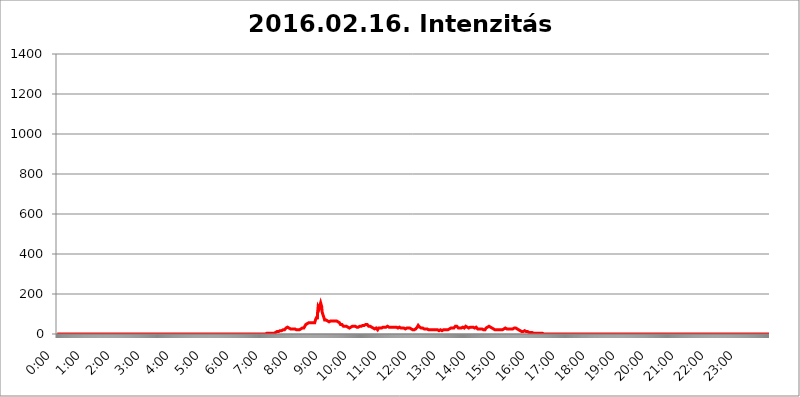
| Category | 2016.02.16. Intenzitás [W/m^2] |
|---|---|
| 0.0 | 0 |
| 0.0006944444444444445 | 0 |
| 0.001388888888888889 | 0 |
| 0.0020833333333333333 | 0 |
| 0.002777777777777778 | 0 |
| 0.003472222222222222 | 0 |
| 0.004166666666666667 | 0 |
| 0.004861111111111111 | 0 |
| 0.005555555555555556 | 0 |
| 0.0062499999999999995 | 0 |
| 0.006944444444444444 | 0 |
| 0.007638888888888889 | 0 |
| 0.008333333333333333 | 0 |
| 0.009027777777777779 | 0 |
| 0.009722222222222222 | 0 |
| 0.010416666666666666 | 0 |
| 0.011111111111111112 | 0 |
| 0.011805555555555555 | 0 |
| 0.012499999999999999 | 0 |
| 0.013194444444444444 | 0 |
| 0.013888888888888888 | 0 |
| 0.014583333333333332 | 0 |
| 0.015277777777777777 | 0 |
| 0.015972222222222224 | 0 |
| 0.016666666666666666 | 0 |
| 0.017361111111111112 | 0 |
| 0.018055555555555557 | 0 |
| 0.01875 | 0 |
| 0.019444444444444445 | 0 |
| 0.02013888888888889 | 0 |
| 0.020833333333333332 | 0 |
| 0.02152777777777778 | 0 |
| 0.022222222222222223 | 0 |
| 0.02291666666666667 | 0 |
| 0.02361111111111111 | 0 |
| 0.024305555555555556 | 0 |
| 0.024999999999999998 | 0 |
| 0.025694444444444447 | 0 |
| 0.02638888888888889 | 0 |
| 0.027083333333333334 | 0 |
| 0.027777777777777776 | 0 |
| 0.02847222222222222 | 0 |
| 0.029166666666666664 | 0 |
| 0.029861111111111113 | 0 |
| 0.030555555555555555 | 0 |
| 0.03125 | 0 |
| 0.03194444444444445 | 0 |
| 0.03263888888888889 | 0 |
| 0.03333333333333333 | 0 |
| 0.034027777777777775 | 0 |
| 0.034722222222222224 | 0 |
| 0.035416666666666666 | 0 |
| 0.036111111111111115 | 0 |
| 0.03680555555555556 | 0 |
| 0.0375 | 0 |
| 0.03819444444444444 | 0 |
| 0.03888888888888889 | 0 |
| 0.03958333333333333 | 0 |
| 0.04027777777777778 | 0 |
| 0.04097222222222222 | 0 |
| 0.041666666666666664 | 0 |
| 0.042361111111111106 | 0 |
| 0.04305555555555556 | 0 |
| 0.043750000000000004 | 0 |
| 0.044444444444444446 | 0 |
| 0.04513888888888889 | 0 |
| 0.04583333333333334 | 0 |
| 0.04652777777777778 | 0 |
| 0.04722222222222222 | 0 |
| 0.04791666666666666 | 0 |
| 0.04861111111111111 | 0 |
| 0.049305555555555554 | 0 |
| 0.049999999999999996 | 0 |
| 0.05069444444444445 | 0 |
| 0.051388888888888894 | 0 |
| 0.052083333333333336 | 0 |
| 0.05277777777777778 | 0 |
| 0.05347222222222222 | 0 |
| 0.05416666666666667 | 0 |
| 0.05486111111111111 | 0 |
| 0.05555555555555555 | 0 |
| 0.05625 | 0 |
| 0.05694444444444444 | 0 |
| 0.057638888888888885 | 0 |
| 0.05833333333333333 | 0 |
| 0.05902777777777778 | 0 |
| 0.059722222222222225 | 0 |
| 0.06041666666666667 | 0 |
| 0.061111111111111116 | 0 |
| 0.06180555555555556 | 0 |
| 0.0625 | 0 |
| 0.06319444444444444 | 0 |
| 0.06388888888888888 | 0 |
| 0.06458333333333334 | 0 |
| 0.06527777777777778 | 0 |
| 0.06597222222222222 | 0 |
| 0.06666666666666667 | 0 |
| 0.06736111111111111 | 0 |
| 0.06805555555555555 | 0 |
| 0.06874999999999999 | 0 |
| 0.06944444444444443 | 0 |
| 0.07013888888888889 | 0 |
| 0.07083333333333333 | 0 |
| 0.07152777777777779 | 0 |
| 0.07222222222222223 | 0 |
| 0.07291666666666667 | 0 |
| 0.07361111111111111 | 0 |
| 0.07430555555555556 | 0 |
| 0.075 | 0 |
| 0.07569444444444444 | 0 |
| 0.0763888888888889 | 0 |
| 0.07708333333333334 | 0 |
| 0.07777777777777778 | 0 |
| 0.07847222222222222 | 0 |
| 0.07916666666666666 | 0 |
| 0.0798611111111111 | 0 |
| 0.08055555555555556 | 0 |
| 0.08125 | 0 |
| 0.08194444444444444 | 0 |
| 0.08263888888888889 | 0 |
| 0.08333333333333333 | 0 |
| 0.08402777777777777 | 0 |
| 0.08472222222222221 | 0 |
| 0.08541666666666665 | 0 |
| 0.08611111111111112 | 0 |
| 0.08680555555555557 | 0 |
| 0.08750000000000001 | 0 |
| 0.08819444444444445 | 0 |
| 0.08888888888888889 | 0 |
| 0.08958333333333333 | 0 |
| 0.09027777777777778 | 0 |
| 0.09097222222222222 | 0 |
| 0.09166666666666667 | 0 |
| 0.09236111111111112 | 0 |
| 0.09305555555555556 | 0 |
| 0.09375 | 0 |
| 0.09444444444444444 | 0 |
| 0.09513888888888888 | 0 |
| 0.09583333333333333 | 0 |
| 0.09652777777777777 | 0 |
| 0.09722222222222222 | 0 |
| 0.09791666666666667 | 0 |
| 0.09861111111111111 | 0 |
| 0.09930555555555555 | 0 |
| 0.09999999999999999 | 0 |
| 0.10069444444444443 | 0 |
| 0.1013888888888889 | 0 |
| 0.10208333333333335 | 0 |
| 0.10277777777777779 | 0 |
| 0.10347222222222223 | 0 |
| 0.10416666666666667 | 0 |
| 0.10486111111111111 | 0 |
| 0.10555555555555556 | 0 |
| 0.10625 | 0 |
| 0.10694444444444444 | 0 |
| 0.1076388888888889 | 0 |
| 0.10833333333333334 | 0 |
| 0.10902777777777778 | 0 |
| 0.10972222222222222 | 0 |
| 0.1111111111111111 | 0 |
| 0.11180555555555556 | 0 |
| 0.11180555555555556 | 0 |
| 0.1125 | 0 |
| 0.11319444444444444 | 0 |
| 0.11388888888888889 | 0 |
| 0.11458333333333333 | 0 |
| 0.11527777777777777 | 0 |
| 0.11597222222222221 | 0 |
| 0.11666666666666665 | 0 |
| 0.1173611111111111 | 0 |
| 0.11805555555555557 | 0 |
| 0.11944444444444445 | 0 |
| 0.12013888888888889 | 0 |
| 0.12083333333333333 | 0 |
| 0.12152777777777778 | 0 |
| 0.12222222222222223 | 0 |
| 0.12291666666666667 | 0 |
| 0.12291666666666667 | 0 |
| 0.12361111111111112 | 0 |
| 0.12430555555555556 | 0 |
| 0.125 | 0 |
| 0.12569444444444444 | 0 |
| 0.12638888888888888 | 0 |
| 0.12708333333333333 | 0 |
| 0.16875 | 0 |
| 0.12847222222222224 | 0 |
| 0.12916666666666668 | 0 |
| 0.12986111111111112 | 0 |
| 0.13055555555555556 | 0 |
| 0.13125 | 0 |
| 0.13194444444444445 | 0 |
| 0.1326388888888889 | 0 |
| 0.13333333333333333 | 0 |
| 0.13402777777777777 | 0 |
| 0.13402777777777777 | 0 |
| 0.13472222222222222 | 0 |
| 0.13541666666666666 | 0 |
| 0.1361111111111111 | 0 |
| 0.13749999999999998 | 0 |
| 0.13819444444444443 | 0 |
| 0.1388888888888889 | 0 |
| 0.13958333333333334 | 0 |
| 0.14027777777777778 | 0 |
| 0.14097222222222222 | 0 |
| 0.14166666666666666 | 0 |
| 0.1423611111111111 | 0 |
| 0.14305555555555557 | 0 |
| 0.14375000000000002 | 0 |
| 0.14444444444444446 | 0 |
| 0.1451388888888889 | 0 |
| 0.1451388888888889 | 0 |
| 0.14652777777777778 | 0 |
| 0.14722222222222223 | 0 |
| 0.14791666666666667 | 0 |
| 0.1486111111111111 | 0 |
| 0.14930555555555555 | 0 |
| 0.15 | 0 |
| 0.15069444444444444 | 0 |
| 0.15138888888888888 | 0 |
| 0.15208333333333332 | 0 |
| 0.15277777777777776 | 0 |
| 0.15347222222222223 | 0 |
| 0.15416666666666667 | 0 |
| 0.15486111111111112 | 0 |
| 0.15555555555555556 | 0 |
| 0.15625 | 0 |
| 0.15694444444444444 | 0 |
| 0.15763888888888888 | 0 |
| 0.15833333333333333 | 0 |
| 0.15902777777777777 | 0 |
| 0.15972222222222224 | 0 |
| 0.16041666666666668 | 0 |
| 0.16111111111111112 | 0 |
| 0.16180555555555556 | 0 |
| 0.1625 | 0 |
| 0.16319444444444445 | 0 |
| 0.1638888888888889 | 0 |
| 0.16458333333333333 | 0 |
| 0.16527777777777777 | 0 |
| 0.16597222222222222 | 0 |
| 0.16666666666666666 | 0 |
| 0.1673611111111111 | 0 |
| 0.16805555555555554 | 0 |
| 0.16874999999999998 | 0 |
| 0.16944444444444443 | 0 |
| 0.17013888888888887 | 0 |
| 0.1708333333333333 | 0 |
| 0.17152777777777775 | 0 |
| 0.17222222222222225 | 0 |
| 0.1729166666666667 | 0 |
| 0.17361111111111113 | 0 |
| 0.17430555555555557 | 0 |
| 0.17500000000000002 | 0 |
| 0.17569444444444446 | 0 |
| 0.1763888888888889 | 0 |
| 0.17708333333333334 | 0 |
| 0.17777777777777778 | 0 |
| 0.17847222222222223 | 0 |
| 0.17916666666666667 | 0 |
| 0.1798611111111111 | 0 |
| 0.18055555555555555 | 0 |
| 0.18125 | 0 |
| 0.18194444444444444 | 0 |
| 0.1826388888888889 | 0 |
| 0.18333333333333335 | 0 |
| 0.1840277777777778 | 0 |
| 0.18472222222222223 | 0 |
| 0.18541666666666667 | 0 |
| 0.18611111111111112 | 0 |
| 0.18680555555555556 | 0 |
| 0.1875 | 0 |
| 0.18819444444444444 | 0 |
| 0.18888888888888888 | 0 |
| 0.18958333333333333 | 0 |
| 0.19027777777777777 | 0 |
| 0.1909722222222222 | 0 |
| 0.19166666666666665 | 0 |
| 0.19236111111111112 | 0 |
| 0.19305555555555554 | 0 |
| 0.19375 | 0 |
| 0.19444444444444445 | 0 |
| 0.1951388888888889 | 0 |
| 0.19583333333333333 | 0 |
| 0.19652777777777777 | 0 |
| 0.19722222222222222 | 0 |
| 0.19791666666666666 | 0 |
| 0.1986111111111111 | 0 |
| 0.19930555555555554 | 0 |
| 0.19999999999999998 | 0 |
| 0.20069444444444443 | 0 |
| 0.20138888888888887 | 0 |
| 0.2020833333333333 | 0 |
| 0.2027777777777778 | 0 |
| 0.2034722222222222 | 0 |
| 0.2041666666666667 | 0 |
| 0.20486111111111113 | 0 |
| 0.20555555555555557 | 0 |
| 0.20625000000000002 | 0 |
| 0.20694444444444446 | 0 |
| 0.2076388888888889 | 0 |
| 0.20833333333333334 | 0 |
| 0.20902777777777778 | 0 |
| 0.20972222222222223 | 0 |
| 0.21041666666666667 | 0 |
| 0.2111111111111111 | 0 |
| 0.21180555555555555 | 0 |
| 0.2125 | 0 |
| 0.21319444444444444 | 0 |
| 0.2138888888888889 | 0 |
| 0.21458333333333335 | 0 |
| 0.2152777777777778 | 0 |
| 0.21597222222222223 | 0 |
| 0.21666666666666667 | 0 |
| 0.21736111111111112 | 0 |
| 0.21805555555555556 | 0 |
| 0.21875 | 0 |
| 0.21944444444444444 | 0 |
| 0.22013888888888888 | 0 |
| 0.22083333333333333 | 0 |
| 0.22152777777777777 | 0 |
| 0.2222222222222222 | 0 |
| 0.22291666666666665 | 0 |
| 0.2236111111111111 | 0 |
| 0.22430555555555556 | 0 |
| 0.225 | 0 |
| 0.22569444444444445 | 0 |
| 0.2263888888888889 | 0 |
| 0.22708333333333333 | 0 |
| 0.22777777777777777 | 0 |
| 0.22847222222222222 | 0 |
| 0.22916666666666666 | 0 |
| 0.2298611111111111 | 0 |
| 0.23055555555555554 | 0 |
| 0.23124999999999998 | 0 |
| 0.23194444444444443 | 0 |
| 0.23263888888888887 | 0 |
| 0.2333333333333333 | 0 |
| 0.2340277777777778 | 0 |
| 0.2347222222222222 | 0 |
| 0.2354166666666667 | 0 |
| 0.23611111111111113 | 0 |
| 0.23680555555555557 | 0 |
| 0.23750000000000002 | 0 |
| 0.23819444444444446 | 0 |
| 0.2388888888888889 | 0 |
| 0.23958333333333334 | 0 |
| 0.24027777777777778 | 0 |
| 0.24097222222222223 | 0 |
| 0.24166666666666667 | 0 |
| 0.2423611111111111 | 0 |
| 0.24305555555555555 | 0 |
| 0.24375 | 0 |
| 0.24444444444444446 | 0 |
| 0.24513888888888888 | 0 |
| 0.24583333333333335 | 0 |
| 0.2465277777777778 | 0 |
| 0.24722222222222223 | 0 |
| 0.24791666666666667 | 0 |
| 0.24861111111111112 | 0 |
| 0.24930555555555556 | 0 |
| 0.25 | 0 |
| 0.25069444444444444 | 0 |
| 0.2513888888888889 | 0 |
| 0.2520833333333333 | 0 |
| 0.25277777777777777 | 0 |
| 0.2534722222222222 | 0 |
| 0.25416666666666665 | 0 |
| 0.2548611111111111 | 0 |
| 0.2555555555555556 | 0 |
| 0.25625000000000003 | 0 |
| 0.2569444444444445 | 0 |
| 0.2576388888888889 | 0 |
| 0.25833333333333336 | 0 |
| 0.2590277777777778 | 0 |
| 0.25972222222222224 | 0 |
| 0.2604166666666667 | 0 |
| 0.2611111111111111 | 0 |
| 0.26180555555555557 | 0 |
| 0.2625 | 0 |
| 0.26319444444444445 | 0 |
| 0.2638888888888889 | 0 |
| 0.26458333333333334 | 0 |
| 0.2652777777777778 | 0 |
| 0.2659722222222222 | 0 |
| 0.26666666666666666 | 0 |
| 0.2673611111111111 | 0 |
| 0.26805555555555555 | 0 |
| 0.26875 | 0 |
| 0.26944444444444443 | 0 |
| 0.2701388888888889 | 0 |
| 0.2708333333333333 | 0 |
| 0.27152777777777776 | 0 |
| 0.2722222222222222 | 0 |
| 0.27291666666666664 | 0 |
| 0.2736111111111111 | 0 |
| 0.2743055555555555 | 0 |
| 0.27499999999999997 | 0 |
| 0.27569444444444446 | 0 |
| 0.27638888888888885 | 0 |
| 0.27708333333333335 | 0 |
| 0.2777777777777778 | 0 |
| 0.27847222222222223 | 0 |
| 0.2791666666666667 | 0 |
| 0.2798611111111111 | 0 |
| 0.28055555555555556 | 0 |
| 0.28125 | 0 |
| 0.28194444444444444 | 0 |
| 0.2826388888888889 | 0 |
| 0.2833333333333333 | 0 |
| 0.28402777777777777 | 0 |
| 0.2847222222222222 | 0 |
| 0.28541666666666665 | 0 |
| 0.28611111111111115 | 0 |
| 0.28680555555555554 | 0 |
| 0.28750000000000003 | 0 |
| 0.2881944444444445 | 0 |
| 0.2888888888888889 | 0 |
| 0.28958333333333336 | 0 |
| 0.2902777777777778 | 0 |
| 0.29097222222222224 | 0 |
| 0.2916666666666667 | 0 |
| 0.2923611111111111 | 0 |
| 0.29305555555555557 | 3.525 |
| 0.29375 | 3.525 |
| 0.29444444444444445 | 3.525 |
| 0.2951388888888889 | 3.525 |
| 0.29583333333333334 | 3.525 |
| 0.2965277777777778 | 3.525 |
| 0.2972222222222222 | 3.525 |
| 0.29791666666666666 | 3.525 |
| 0.2986111111111111 | 3.525 |
| 0.29930555555555555 | 3.525 |
| 0.3 | 3.525 |
| 0.30069444444444443 | 3.525 |
| 0.3013888888888889 | 3.525 |
| 0.3020833333333333 | 3.525 |
| 0.30277777777777776 | 3.525 |
| 0.3034722222222222 | 7.887 |
| 0.30416666666666664 | 3.525 |
| 0.3048611111111111 | 7.887 |
| 0.3055555555555555 | 7.887 |
| 0.30624999999999997 | 7.887 |
| 0.3069444444444444 | 7.887 |
| 0.3076388888888889 | 7.887 |
| 0.30833333333333335 | 12.257 |
| 0.3090277777777778 | 12.257 |
| 0.30972222222222223 | 12.257 |
| 0.3104166666666667 | 12.257 |
| 0.3111111111111111 | 12.257 |
| 0.31180555555555556 | 12.257 |
| 0.3125 | 16.636 |
| 0.31319444444444444 | 16.636 |
| 0.3138888888888889 | 16.636 |
| 0.3145833333333333 | 16.636 |
| 0.31527777777777777 | 16.636 |
| 0.3159722222222222 | 16.636 |
| 0.31666666666666665 | 21.024 |
| 0.31736111111111115 | 21.024 |
| 0.31805555555555554 | 21.024 |
| 0.31875000000000003 | 21.024 |
| 0.3194444444444445 | 25.419 |
| 0.3201388888888889 | 25.419 |
| 0.32083333333333336 | 29.823 |
| 0.3215277777777778 | 29.823 |
| 0.32222222222222224 | 29.823 |
| 0.3229166666666667 | 34.234 |
| 0.3236111111111111 | 29.823 |
| 0.32430555555555557 | 29.823 |
| 0.325 | 29.823 |
| 0.32569444444444445 | 29.823 |
| 0.3263888888888889 | 25.419 |
| 0.32708333333333334 | 25.419 |
| 0.3277777777777778 | 25.419 |
| 0.3284722222222222 | 25.419 |
| 0.32916666666666666 | 25.419 |
| 0.3298611111111111 | 25.419 |
| 0.33055555555555555 | 25.419 |
| 0.33125 | 25.419 |
| 0.33194444444444443 | 21.024 |
| 0.3326388888888889 | 25.419 |
| 0.3333333333333333 | 25.419 |
| 0.3340277777777778 | 25.419 |
| 0.3347222222222222 | 25.419 |
| 0.3354166666666667 | 21.024 |
| 0.3361111111111111 | 21.024 |
| 0.3368055555555556 | 25.419 |
| 0.33749999999999997 | 21.024 |
| 0.33819444444444446 | 21.024 |
| 0.33888888888888885 | 21.024 |
| 0.33958333333333335 | 21.024 |
| 0.34027777777777773 | 21.024 |
| 0.34097222222222223 | 25.419 |
| 0.3416666666666666 | 25.419 |
| 0.3423611111111111 | 29.823 |
| 0.3430555555555555 | 29.823 |
| 0.34375 | 29.823 |
| 0.3444444444444445 | 29.823 |
| 0.3451388888888889 | 29.823 |
| 0.3458333333333334 | 29.823 |
| 0.34652777777777777 | 34.234 |
| 0.34722222222222227 | 38.653 |
| 0.34791666666666665 | 43.079 |
| 0.34861111111111115 | 47.511 |
| 0.34930555555555554 | 47.511 |
| 0.35000000000000003 | 47.511 |
| 0.3506944444444444 | 51.951 |
| 0.3513888888888889 | 56.398 |
| 0.3520833333333333 | 56.398 |
| 0.3527777777777778 | 56.398 |
| 0.3534722222222222 | 56.398 |
| 0.3541666666666667 | 56.398 |
| 0.3548611111111111 | 56.398 |
| 0.35555555555555557 | 56.398 |
| 0.35625 | 56.398 |
| 0.35694444444444445 | 56.398 |
| 0.3576388888888889 | 56.398 |
| 0.35833333333333334 | 56.398 |
| 0.3590277777777778 | 56.398 |
| 0.3597222222222222 | 60.85 |
| 0.36041666666666666 | 56.398 |
| 0.3611111111111111 | 56.398 |
| 0.36180555555555555 | 60.85 |
| 0.3625 | 74.246 |
| 0.36319444444444443 | 74.246 |
| 0.3638888888888889 | 83.205 |
| 0.3645833333333333 | 74.246 |
| 0.3652777777777778 | 110.201 |
| 0.3659722222222222 | 137.347 |
| 0.3666666666666667 | 137.347 |
| 0.3673611111111111 | 128.284 |
| 0.3680555555555556 | 128.284 |
| 0.36874999999999997 | 146.423 |
| 0.36944444444444446 | 155.509 |
| 0.37013888888888885 | 146.423 |
| 0.37083333333333335 | 137.347 |
| 0.37152777777777773 | 110.201 |
| 0.37222222222222223 | 101.184 |
| 0.3729166666666666 | 96.682 |
| 0.3736111111111111 | 96.682 |
| 0.3743055555555555 | 78.722 |
| 0.375 | 69.775 |
| 0.3756944444444445 | 74.246 |
| 0.3763888888888889 | 69.775 |
| 0.3770833333333334 | 69.775 |
| 0.37777777777777777 | 69.775 |
| 0.37847222222222227 | 65.31 |
| 0.37916666666666665 | 65.31 |
| 0.37986111111111115 | 65.31 |
| 0.38055555555555554 | 60.85 |
| 0.38125000000000003 | 60.85 |
| 0.3819444444444444 | 60.85 |
| 0.3826388888888889 | 60.85 |
| 0.3833333333333333 | 65.31 |
| 0.3840277777777778 | 65.31 |
| 0.3847222222222222 | 65.31 |
| 0.3854166666666667 | 65.31 |
| 0.3861111111111111 | 65.31 |
| 0.38680555555555557 | 60.85 |
| 0.3875 | 65.31 |
| 0.38819444444444445 | 60.85 |
| 0.3888888888888889 | 60.85 |
| 0.38958333333333334 | 65.31 |
| 0.3902777777777778 | 65.31 |
| 0.3909722222222222 | 65.31 |
| 0.39166666666666666 | 65.31 |
| 0.3923611111111111 | 65.31 |
| 0.39305555555555555 | 60.85 |
| 0.39375 | 60.85 |
| 0.39444444444444443 | 56.398 |
| 0.3951388888888889 | 56.398 |
| 0.3958333333333333 | 56.398 |
| 0.3965277777777778 | 51.951 |
| 0.3972222222222222 | 47.511 |
| 0.3979166666666667 | 47.511 |
| 0.3986111111111111 | 47.511 |
| 0.3993055555555556 | 47.511 |
| 0.39999999999999997 | 43.079 |
| 0.40069444444444446 | 43.079 |
| 0.40138888888888885 | 38.653 |
| 0.40208333333333335 | 43.079 |
| 0.40277777777777773 | 43.079 |
| 0.40347222222222223 | 38.653 |
| 0.4041666666666666 | 43.079 |
| 0.4048611111111111 | 38.653 |
| 0.4055555555555555 | 38.653 |
| 0.40625 | 38.653 |
| 0.4069444444444445 | 34.234 |
| 0.4076388888888889 | 34.234 |
| 0.4083333333333334 | 34.234 |
| 0.40902777777777777 | 29.823 |
| 0.40972222222222227 | 29.823 |
| 0.41041666666666665 | 34.234 |
| 0.41111111111111115 | 34.234 |
| 0.41180555555555554 | 34.234 |
| 0.41250000000000003 | 34.234 |
| 0.4131944444444444 | 38.653 |
| 0.4138888888888889 | 38.653 |
| 0.4145833333333333 | 38.653 |
| 0.4152777777777778 | 38.653 |
| 0.4159722222222222 | 38.653 |
| 0.4166666666666667 | 38.653 |
| 0.4173611111111111 | 34.234 |
| 0.41805555555555557 | 38.653 |
| 0.41875 | 34.234 |
| 0.41944444444444445 | 34.234 |
| 0.4201388888888889 | 34.234 |
| 0.42083333333333334 | 38.653 |
| 0.4215277777777778 | 38.653 |
| 0.4222222222222222 | 34.234 |
| 0.42291666666666666 | 38.653 |
| 0.4236111111111111 | 38.653 |
| 0.42430555555555555 | 38.653 |
| 0.425 | 38.653 |
| 0.42569444444444443 | 38.653 |
| 0.4263888888888889 | 38.653 |
| 0.4270833333333333 | 38.653 |
| 0.4277777777777778 | 38.653 |
| 0.4284722222222222 | 43.079 |
| 0.4291666666666667 | 38.653 |
| 0.4298611111111111 | 43.079 |
| 0.4305555555555556 | 43.079 |
| 0.43124999999999997 | 43.079 |
| 0.43194444444444446 | 47.511 |
| 0.43263888888888885 | 47.511 |
| 0.43333333333333335 | 47.511 |
| 0.43402777777777773 | 51.951 |
| 0.43472222222222223 | 47.511 |
| 0.4354166666666666 | 47.511 |
| 0.4361111111111111 | 47.511 |
| 0.4368055555555555 | 38.653 |
| 0.4375 | 38.653 |
| 0.4381944444444445 | 38.653 |
| 0.4388888888888889 | 38.653 |
| 0.4395833333333334 | 34.234 |
| 0.44027777777777777 | 34.234 |
| 0.44097222222222227 | 34.234 |
| 0.44166666666666665 | 29.823 |
| 0.44236111111111115 | 29.823 |
| 0.44305555555555554 | 29.823 |
| 0.44375000000000003 | 25.419 |
| 0.4444444444444444 | 25.419 |
| 0.4451388888888889 | 25.419 |
| 0.4458333333333333 | 29.823 |
| 0.4465277777777778 | 25.419 |
| 0.4472222222222222 | 29.823 |
| 0.4479166666666667 | 29.823 |
| 0.4486111111111111 | 29.823 |
| 0.44930555555555557 | 21.024 |
| 0.45 | 25.419 |
| 0.45069444444444445 | 29.823 |
| 0.4513888888888889 | 25.419 |
| 0.45208333333333334 | 29.823 |
| 0.4527777777777778 | 29.823 |
| 0.4534722222222222 | 34.234 |
| 0.45416666666666666 | 34.234 |
| 0.4548611111111111 | 29.823 |
| 0.45555555555555555 | 34.234 |
| 0.45625 | 34.234 |
| 0.45694444444444443 | 34.234 |
| 0.4576388888888889 | 38.653 |
| 0.4583333333333333 | 38.653 |
| 0.4590277777777778 | 34.234 |
| 0.4597222222222222 | 34.234 |
| 0.4604166666666667 | 29.823 |
| 0.4611111111111111 | 34.234 |
| 0.4618055555555556 | 38.653 |
| 0.46249999999999997 | 38.653 |
| 0.46319444444444446 | 38.653 |
| 0.46388888888888885 | 38.653 |
| 0.46458333333333335 | 34.234 |
| 0.46527777777777773 | 34.234 |
| 0.46597222222222223 | 34.234 |
| 0.4666666666666666 | 29.823 |
| 0.4673611111111111 | 34.234 |
| 0.4680555555555555 | 34.234 |
| 0.46875 | 34.234 |
| 0.4694444444444445 | 34.234 |
| 0.4701388888888889 | 38.653 |
| 0.4708333333333334 | 34.234 |
| 0.47152777777777777 | 34.234 |
| 0.47222222222222227 | 34.234 |
| 0.47291666666666665 | 29.823 |
| 0.47361111111111115 | 34.234 |
| 0.47430555555555554 | 34.234 |
| 0.47500000000000003 | 38.653 |
| 0.4756944444444444 | 34.234 |
| 0.4763888888888889 | 29.823 |
| 0.4770833333333333 | 29.823 |
| 0.4777777777777778 | 29.823 |
| 0.4784722222222222 | 29.823 |
| 0.4791666666666667 | 34.234 |
| 0.4798611111111111 | 34.234 |
| 0.48055555555555557 | 29.823 |
| 0.48125 | 29.823 |
| 0.48194444444444445 | 29.823 |
| 0.4826388888888889 | 29.823 |
| 0.48333333333333334 | 29.823 |
| 0.4840277777777778 | 29.823 |
| 0.4847222222222222 | 29.823 |
| 0.48541666666666666 | 29.823 |
| 0.4861111111111111 | 29.823 |
| 0.48680555555555555 | 25.419 |
| 0.4875 | 29.823 |
| 0.48819444444444443 | 25.419 |
| 0.4888888888888889 | 25.419 |
| 0.4895833333333333 | 29.823 |
| 0.4902777777777778 | 29.823 |
| 0.4909722222222222 | 34.234 |
| 0.4916666666666667 | 29.823 |
| 0.4923611111111111 | 29.823 |
| 0.4930555555555556 | 29.823 |
| 0.49374999999999997 | 29.823 |
| 0.49444444444444446 | 29.823 |
| 0.49513888888888885 | 25.419 |
| 0.49583333333333335 | 25.419 |
| 0.49652777777777773 | 25.419 |
| 0.49722222222222223 | 25.419 |
| 0.4979166666666666 | 25.419 |
| 0.4986111111111111 | 21.024 |
| 0.4993055555555555 | 21.024 |
| 0.5 | 21.024 |
| 0.5006944444444444 | 21.024 |
| 0.5013888888888889 | 21.024 |
| 0.5020833333333333 | 25.419 |
| 0.5027777777777778 | 25.419 |
| 0.5034722222222222 | 29.823 |
| 0.5041666666666667 | 29.823 |
| 0.5048611111111111 | 34.234 |
| 0.5055555555555555 | 38.653 |
| 0.50625 | 43.079 |
| 0.5069444444444444 | 38.653 |
| 0.5076388888888889 | 38.653 |
| 0.5083333333333333 | 34.234 |
| 0.5090277777777777 | 29.823 |
| 0.5097222222222222 | 29.823 |
| 0.5104166666666666 | 29.823 |
| 0.5111111111111112 | 29.823 |
| 0.5118055555555555 | 29.823 |
| 0.5125000000000001 | 29.823 |
| 0.5131944444444444 | 25.419 |
| 0.513888888888889 | 25.419 |
| 0.5145833333333333 | 25.419 |
| 0.5152777777777778 | 25.419 |
| 0.5159722222222222 | 25.419 |
| 0.5166666666666667 | 25.419 |
| 0.517361111111111 | 25.419 |
| 0.5180555555555556 | 21.024 |
| 0.5187499999999999 | 25.419 |
| 0.5194444444444445 | 25.419 |
| 0.5201388888888888 | 25.419 |
| 0.5208333333333334 | 21.024 |
| 0.5215277777777778 | 21.024 |
| 0.5222222222222223 | 21.024 |
| 0.5229166666666667 | 21.024 |
| 0.5236111111111111 | 21.024 |
| 0.5243055555555556 | 21.024 |
| 0.525 | 21.024 |
| 0.5256944444444445 | 21.024 |
| 0.5263888888888889 | 21.024 |
| 0.5270833333333333 | 21.024 |
| 0.5277777777777778 | 21.024 |
| 0.5284722222222222 | 21.024 |
| 0.5291666666666667 | 21.024 |
| 0.5298611111111111 | 21.024 |
| 0.5305555555555556 | 21.024 |
| 0.53125 | 21.024 |
| 0.5319444444444444 | 21.024 |
| 0.5326388888888889 | 21.024 |
| 0.5333333333333333 | 21.024 |
| 0.5340277777777778 | 16.636 |
| 0.5347222222222222 | 21.024 |
| 0.5354166666666667 | 16.636 |
| 0.5361111111111111 | 21.024 |
| 0.5368055555555555 | 16.636 |
| 0.5375 | 21.024 |
| 0.5381944444444444 | 16.636 |
| 0.5388888888888889 | 16.636 |
| 0.5395833333333333 | 16.636 |
| 0.5402777777777777 | 16.636 |
| 0.5409722222222222 | 16.636 |
| 0.5416666666666666 | 21.024 |
| 0.5423611111111112 | 21.024 |
| 0.5430555555555555 | 21.024 |
| 0.5437500000000001 | 21.024 |
| 0.5444444444444444 | 21.024 |
| 0.545138888888889 | 21.024 |
| 0.5458333333333333 | 21.024 |
| 0.5465277777777778 | 25.419 |
| 0.5472222222222222 | 25.419 |
| 0.5479166666666667 | 21.024 |
| 0.548611111111111 | 16.636 |
| 0.5493055555555556 | 21.024 |
| 0.5499999999999999 | 25.419 |
| 0.5506944444444445 | 29.823 |
| 0.5513888888888888 | 29.823 |
| 0.5520833333333334 | 29.823 |
| 0.5527777777777778 | 29.823 |
| 0.5534722222222223 | 29.823 |
| 0.5541666666666667 | 29.823 |
| 0.5548611111111111 | 29.823 |
| 0.5555555555555556 | 29.823 |
| 0.55625 | 29.823 |
| 0.5569444444444445 | 34.234 |
| 0.5576388888888889 | 34.234 |
| 0.5583333333333333 | 38.653 |
| 0.5590277777777778 | 38.653 |
| 0.5597222222222222 | 38.653 |
| 0.5604166666666667 | 38.653 |
| 0.5611111111111111 | 38.653 |
| 0.5618055555555556 | 34.234 |
| 0.5625 | 29.823 |
| 0.5631944444444444 | 29.823 |
| 0.5638888888888889 | 29.823 |
| 0.5645833333333333 | 29.823 |
| 0.5652777777777778 | 29.823 |
| 0.5659722222222222 | 29.823 |
| 0.5666666666666667 | 29.823 |
| 0.5673611111111111 | 29.823 |
| 0.5680555555555555 | 29.823 |
| 0.56875 | 34.234 |
| 0.5694444444444444 | 29.823 |
| 0.5701388888888889 | 29.823 |
| 0.5708333333333333 | 29.823 |
| 0.5715277777777777 | 29.823 |
| 0.5722222222222222 | 34.234 |
| 0.5729166666666666 | 38.653 |
| 0.5736111111111112 | 38.653 |
| 0.5743055555555555 | 34.234 |
| 0.5750000000000001 | 34.234 |
| 0.5756944444444444 | 29.823 |
| 0.576388888888889 | 34.234 |
| 0.5770833333333333 | 29.823 |
| 0.5777777777777778 | 34.234 |
| 0.5784722222222222 | 34.234 |
| 0.5791666666666667 | 34.234 |
| 0.579861111111111 | 34.234 |
| 0.5805555555555556 | 34.234 |
| 0.5812499999999999 | 34.234 |
| 0.5819444444444445 | 29.823 |
| 0.5826388888888888 | 34.234 |
| 0.5833333333333334 | 34.234 |
| 0.5840277777777778 | 34.234 |
| 0.5847222222222223 | 29.823 |
| 0.5854166666666667 | 29.823 |
| 0.5861111111111111 | 34.234 |
| 0.5868055555555556 | 34.234 |
| 0.5875 | 34.234 |
| 0.5881944444444445 | 34.234 |
| 0.5888888888888889 | 29.823 |
| 0.5895833333333333 | 25.419 |
| 0.5902777777777778 | 25.419 |
| 0.5909722222222222 | 25.419 |
| 0.5916666666666667 | 25.419 |
| 0.5923611111111111 | 25.419 |
| 0.5930555555555556 | 25.419 |
| 0.59375 | 25.419 |
| 0.5944444444444444 | 25.419 |
| 0.5951388888888889 | 25.419 |
| 0.5958333333333333 | 25.419 |
| 0.5965277777777778 | 25.419 |
| 0.5972222222222222 | 25.419 |
| 0.5979166666666667 | 21.024 |
| 0.5986111111111111 | 25.419 |
| 0.5993055555555555 | 25.419 |
| 0.6 | 21.024 |
| 0.6006944444444444 | 25.419 |
| 0.6013888888888889 | 29.823 |
| 0.6020833333333333 | 29.823 |
| 0.6027777777777777 | 29.823 |
| 0.6034722222222222 | 34.234 |
| 0.6041666666666666 | 34.234 |
| 0.6048611111111112 | 38.653 |
| 0.6055555555555555 | 38.653 |
| 0.6062500000000001 | 34.234 |
| 0.6069444444444444 | 34.234 |
| 0.607638888888889 | 34.234 |
| 0.6083333333333333 | 34.234 |
| 0.6090277777777778 | 29.823 |
| 0.6097222222222222 | 29.823 |
| 0.6104166666666667 | 29.823 |
| 0.611111111111111 | 25.419 |
| 0.6118055555555556 | 25.419 |
| 0.6124999999999999 | 25.419 |
| 0.6131944444444445 | 21.024 |
| 0.6138888888888888 | 21.024 |
| 0.6145833333333334 | 21.024 |
| 0.6152777777777778 | 21.024 |
| 0.6159722222222223 | 21.024 |
| 0.6166666666666667 | 21.024 |
| 0.6173611111111111 | 21.024 |
| 0.6180555555555556 | 21.024 |
| 0.61875 | 21.024 |
| 0.6194444444444445 | 21.024 |
| 0.6201388888888889 | 21.024 |
| 0.6208333333333333 | 21.024 |
| 0.6215277777777778 | 21.024 |
| 0.6222222222222222 | 21.024 |
| 0.6229166666666667 | 21.024 |
| 0.6236111111111111 | 21.024 |
| 0.6243055555555556 | 21.024 |
| 0.625 | 21.024 |
| 0.6256944444444444 | 25.419 |
| 0.6263888888888889 | 25.419 |
| 0.6270833333333333 | 25.419 |
| 0.6277777777777778 | 25.419 |
| 0.6284722222222222 | 29.823 |
| 0.6291666666666667 | 25.419 |
| 0.6298611111111111 | 25.419 |
| 0.6305555555555555 | 25.419 |
| 0.63125 | 25.419 |
| 0.6319444444444444 | 25.419 |
| 0.6326388888888889 | 25.419 |
| 0.6333333333333333 | 25.419 |
| 0.6340277777777777 | 25.419 |
| 0.6347222222222222 | 25.419 |
| 0.6354166666666666 | 25.419 |
| 0.6361111111111112 | 25.419 |
| 0.6368055555555555 | 25.419 |
| 0.6375000000000001 | 25.419 |
| 0.6381944444444444 | 29.823 |
| 0.638888888888889 | 25.419 |
| 0.6395833333333333 | 29.823 |
| 0.6402777777777778 | 29.823 |
| 0.6409722222222222 | 29.823 |
| 0.6416666666666667 | 29.823 |
| 0.642361111111111 | 29.823 |
| 0.6430555555555556 | 29.823 |
| 0.6437499999999999 | 29.823 |
| 0.6444444444444445 | 29.823 |
| 0.6451388888888888 | 25.419 |
| 0.6458333333333334 | 25.419 |
| 0.6465277777777778 | 21.024 |
| 0.6472222222222223 | 21.024 |
| 0.6479166666666667 | 21.024 |
| 0.6486111111111111 | 21.024 |
| 0.6493055555555556 | 16.636 |
| 0.65 | 16.636 |
| 0.6506944444444445 | 16.636 |
| 0.6513888888888889 | 12.257 |
| 0.6520833333333333 | 12.257 |
| 0.6527777777777778 | 12.257 |
| 0.6534722222222222 | 12.257 |
| 0.6541666666666667 | 12.257 |
| 0.6548611111111111 | 16.636 |
| 0.6555555555555556 | 16.636 |
| 0.65625 | 12.257 |
| 0.6569444444444444 | 12.257 |
| 0.6576388888888889 | 12.257 |
| 0.6583333333333333 | 12.257 |
| 0.6590277777777778 | 12.257 |
| 0.6597222222222222 | 12.257 |
| 0.6604166666666667 | 12.257 |
| 0.6611111111111111 | 7.887 |
| 0.6618055555555555 | 7.887 |
| 0.6625 | 7.887 |
| 0.6631944444444444 | 7.887 |
| 0.6638888888888889 | 7.887 |
| 0.6645833333333333 | 7.887 |
| 0.6652777777777777 | 7.887 |
| 0.6659722222222222 | 7.887 |
| 0.6666666666666666 | 7.887 |
| 0.6673611111111111 | 3.525 |
| 0.6680555555555556 | 3.525 |
| 0.6687500000000001 | 3.525 |
| 0.6694444444444444 | 3.525 |
| 0.6701388888888888 | 3.525 |
| 0.6708333333333334 | 3.525 |
| 0.6715277777777778 | 3.525 |
| 0.6722222222222222 | 3.525 |
| 0.6729166666666666 | 3.525 |
| 0.6736111111111112 | 3.525 |
| 0.6743055555555556 | 3.525 |
| 0.6749999999999999 | 3.525 |
| 0.6756944444444444 | 3.525 |
| 0.6763888888888889 | 3.525 |
| 0.6770833333333334 | 3.525 |
| 0.6777777777777777 | 3.525 |
| 0.6784722222222223 | 3.525 |
| 0.6791666666666667 | 3.525 |
| 0.6798611111111111 | 3.525 |
| 0.6805555555555555 | 3.525 |
| 0.68125 | 0 |
| 0.6819444444444445 | 0 |
| 0.6826388888888889 | 0 |
| 0.6833333333333332 | 0 |
| 0.6840277777777778 | 0 |
| 0.6847222222222222 | 0 |
| 0.6854166666666667 | 0 |
| 0.686111111111111 | 0 |
| 0.6868055555555556 | 0 |
| 0.6875 | 0 |
| 0.6881944444444444 | 0 |
| 0.688888888888889 | 0 |
| 0.6895833333333333 | 0 |
| 0.6902777777777778 | 0 |
| 0.6909722222222222 | 0 |
| 0.6916666666666668 | 0 |
| 0.6923611111111111 | 0 |
| 0.6930555555555555 | 0 |
| 0.69375 | 0 |
| 0.6944444444444445 | 0 |
| 0.6951388888888889 | 0 |
| 0.6958333333333333 | 0 |
| 0.6965277777777777 | 0 |
| 0.6972222222222223 | 0 |
| 0.6979166666666666 | 0 |
| 0.6986111111111111 | 0 |
| 0.6993055555555556 | 0 |
| 0.7000000000000001 | 0 |
| 0.7006944444444444 | 0 |
| 0.7013888888888888 | 0 |
| 0.7020833333333334 | 0 |
| 0.7027777777777778 | 0 |
| 0.7034722222222222 | 0 |
| 0.7041666666666666 | 0 |
| 0.7048611111111112 | 0 |
| 0.7055555555555556 | 0 |
| 0.7062499999999999 | 0 |
| 0.7069444444444444 | 0 |
| 0.7076388888888889 | 0 |
| 0.7083333333333334 | 0 |
| 0.7090277777777777 | 0 |
| 0.7097222222222223 | 0 |
| 0.7104166666666667 | 0 |
| 0.7111111111111111 | 0 |
| 0.7118055555555555 | 0 |
| 0.7125 | 0 |
| 0.7131944444444445 | 0 |
| 0.7138888888888889 | 0 |
| 0.7145833333333332 | 0 |
| 0.7152777777777778 | 0 |
| 0.7159722222222222 | 0 |
| 0.7166666666666667 | 0 |
| 0.717361111111111 | 0 |
| 0.7180555555555556 | 0 |
| 0.71875 | 0 |
| 0.7194444444444444 | 0 |
| 0.720138888888889 | 0 |
| 0.7208333333333333 | 0 |
| 0.7215277777777778 | 0 |
| 0.7222222222222222 | 0 |
| 0.7229166666666668 | 0 |
| 0.7236111111111111 | 0 |
| 0.7243055555555555 | 0 |
| 0.725 | 0 |
| 0.7256944444444445 | 0 |
| 0.7263888888888889 | 0 |
| 0.7270833333333333 | 0 |
| 0.7277777777777777 | 0 |
| 0.7284722222222223 | 0 |
| 0.7291666666666666 | 0 |
| 0.7298611111111111 | 0 |
| 0.7305555555555556 | 0 |
| 0.7312500000000001 | 0 |
| 0.7319444444444444 | 0 |
| 0.7326388888888888 | 0 |
| 0.7333333333333334 | 0 |
| 0.7340277777777778 | 0 |
| 0.7347222222222222 | 0 |
| 0.7354166666666666 | 0 |
| 0.7361111111111112 | 0 |
| 0.7368055555555556 | 0 |
| 0.7374999999999999 | 0 |
| 0.7381944444444444 | 0 |
| 0.7388888888888889 | 0 |
| 0.7395833333333334 | 0 |
| 0.7402777777777777 | 0 |
| 0.7409722222222223 | 0 |
| 0.7416666666666667 | 0 |
| 0.7423611111111111 | 0 |
| 0.7430555555555555 | 0 |
| 0.74375 | 0 |
| 0.7444444444444445 | 0 |
| 0.7451388888888889 | 0 |
| 0.7458333333333332 | 0 |
| 0.7465277777777778 | 0 |
| 0.7472222222222222 | 0 |
| 0.7479166666666667 | 0 |
| 0.748611111111111 | 0 |
| 0.7493055555555556 | 0 |
| 0.75 | 0 |
| 0.7506944444444444 | 0 |
| 0.751388888888889 | 0 |
| 0.7520833333333333 | 0 |
| 0.7527777777777778 | 0 |
| 0.7534722222222222 | 0 |
| 0.7541666666666668 | 0 |
| 0.7548611111111111 | 0 |
| 0.7555555555555555 | 0 |
| 0.75625 | 0 |
| 0.7569444444444445 | 0 |
| 0.7576388888888889 | 0 |
| 0.7583333333333333 | 0 |
| 0.7590277777777777 | 0 |
| 0.7597222222222223 | 0 |
| 0.7604166666666666 | 0 |
| 0.7611111111111111 | 0 |
| 0.7618055555555556 | 0 |
| 0.7625000000000001 | 0 |
| 0.7631944444444444 | 0 |
| 0.7638888888888888 | 0 |
| 0.7645833333333334 | 0 |
| 0.7652777777777778 | 0 |
| 0.7659722222222222 | 0 |
| 0.7666666666666666 | 0 |
| 0.7673611111111112 | 0 |
| 0.7680555555555556 | 0 |
| 0.7687499999999999 | 0 |
| 0.7694444444444444 | 0 |
| 0.7701388888888889 | 0 |
| 0.7708333333333334 | 0 |
| 0.7715277777777777 | 0 |
| 0.7722222222222223 | 0 |
| 0.7729166666666667 | 0 |
| 0.7736111111111111 | 0 |
| 0.7743055555555555 | 0 |
| 0.775 | 0 |
| 0.7756944444444445 | 0 |
| 0.7763888888888889 | 0 |
| 0.7770833333333332 | 0 |
| 0.7777777777777778 | 0 |
| 0.7784722222222222 | 0 |
| 0.7791666666666667 | 0 |
| 0.779861111111111 | 0 |
| 0.7805555555555556 | 0 |
| 0.78125 | 0 |
| 0.7819444444444444 | 0 |
| 0.782638888888889 | 0 |
| 0.7833333333333333 | 0 |
| 0.7840277777777778 | 0 |
| 0.7847222222222222 | 0 |
| 0.7854166666666668 | 0 |
| 0.7861111111111111 | 0 |
| 0.7868055555555555 | 0 |
| 0.7875 | 0 |
| 0.7881944444444445 | 0 |
| 0.7888888888888889 | 0 |
| 0.7895833333333333 | 0 |
| 0.7902777777777777 | 0 |
| 0.7909722222222223 | 0 |
| 0.7916666666666666 | 0 |
| 0.7923611111111111 | 0 |
| 0.7930555555555556 | 0 |
| 0.7937500000000001 | 0 |
| 0.7944444444444444 | 0 |
| 0.7951388888888888 | 0 |
| 0.7958333333333334 | 0 |
| 0.7965277777777778 | 0 |
| 0.7972222222222222 | 0 |
| 0.7979166666666666 | 0 |
| 0.7986111111111112 | 0 |
| 0.7993055555555556 | 0 |
| 0.7999999999999999 | 0 |
| 0.8006944444444444 | 0 |
| 0.8013888888888889 | 0 |
| 0.8020833333333334 | 0 |
| 0.8027777777777777 | 0 |
| 0.8034722222222223 | 0 |
| 0.8041666666666667 | 0 |
| 0.8048611111111111 | 0 |
| 0.8055555555555555 | 0 |
| 0.80625 | 0 |
| 0.8069444444444445 | 0 |
| 0.8076388888888889 | 0 |
| 0.8083333333333332 | 0 |
| 0.8090277777777778 | 0 |
| 0.8097222222222222 | 0 |
| 0.8104166666666667 | 0 |
| 0.811111111111111 | 0 |
| 0.8118055555555556 | 0 |
| 0.8125 | 0 |
| 0.8131944444444444 | 0 |
| 0.813888888888889 | 0 |
| 0.8145833333333333 | 0 |
| 0.8152777777777778 | 0 |
| 0.8159722222222222 | 0 |
| 0.8166666666666668 | 0 |
| 0.8173611111111111 | 0 |
| 0.8180555555555555 | 0 |
| 0.81875 | 0 |
| 0.8194444444444445 | 0 |
| 0.8201388888888889 | 0 |
| 0.8208333333333333 | 0 |
| 0.8215277777777777 | 0 |
| 0.8222222222222223 | 0 |
| 0.8229166666666666 | 0 |
| 0.8236111111111111 | 0 |
| 0.8243055555555556 | 0 |
| 0.8250000000000001 | 0 |
| 0.8256944444444444 | 0 |
| 0.8263888888888888 | 0 |
| 0.8270833333333334 | 0 |
| 0.8277777777777778 | 0 |
| 0.8284722222222222 | 0 |
| 0.8291666666666666 | 0 |
| 0.8298611111111112 | 0 |
| 0.8305555555555556 | 0 |
| 0.8312499999999999 | 0 |
| 0.8319444444444444 | 0 |
| 0.8326388888888889 | 0 |
| 0.8333333333333334 | 0 |
| 0.8340277777777777 | 0 |
| 0.8347222222222223 | 0 |
| 0.8354166666666667 | 0 |
| 0.8361111111111111 | 0 |
| 0.8368055555555555 | 0 |
| 0.8375 | 0 |
| 0.8381944444444445 | 0 |
| 0.8388888888888889 | 0 |
| 0.8395833333333332 | 0 |
| 0.8402777777777778 | 0 |
| 0.8409722222222222 | 0 |
| 0.8416666666666667 | 0 |
| 0.842361111111111 | 0 |
| 0.8430555555555556 | 0 |
| 0.84375 | 0 |
| 0.8444444444444444 | 0 |
| 0.845138888888889 | 0 |
| 0.8458333333333333 | 0 |
| 0.8465277777777778 | 0 |
| 0.8472222222222222 | 0 |
| 0.8479166666666668 | 0 |
| 0.8486111111111111 | 0 |
| 0.8493055555555555 | 0 |
| 0.85 | 0 |
| 0.8506944444444445 | 0 |
| 0.8513888888888889 | 0 |
| 0.8520833333333333 | 0 |
| 0.8527777777777777 | 0 |
| 0.8534722222222223 | 0 |
| 0.8541666666666666 | 0 |
| 0.8548611111111111 | 0 |
| 0.8555555555555556 | 0 |
| 0.8562500000000001 | 0 |
| 0.8569444444444444 | 0 |
| 0.8576388888888888 | 0 |
| 0.8583333333333334 | 0 |
| 0.8590277777777778 | 0 |
| 0.8597222222222222 | 0 |
| 0.8604166666666666 | 0 |
| 0.8611111111111112 | 0 |
| 0.8618055555555556 | 0 |
| 0.8624999999999999 | 0 |
| 0.8631944444444444 | 0 |
| 0.8638888888888889 | 0 |
| 0.8645833333333334 | 0 |
| 0.8652777777777777 | 0 |
| 0.8659722222222223 | 0 |
| 0.8666666666666667 | 0 |
| 0.8673611111111111 | 0 |
| 0.8680555555555555 | 0 |
| 0.86875 | 0 |
| 0.8694444444444445 | 0 |
| 0.8701388888888889 | 0 |
| 0.8708333333333332 | 0 |
| 0.8715277777777778 | 0 |
| 0.8722222222222222 | 0 |
| 0.8729166666666667 | 0 |
| 0.873611111111111 | 0 |
| 0.8743055555555556 | 0 |
| 0.875 | 0 |
| 0.8756944444444444 | 0 |
| 0.876388888888889 | 0 |
| 0.8770833333333333 | 0 |
| 0.8777777777777778 | 0 |
| 0.8784722222222222 | 0 |
| 0.8791666666666668 | 0 |
| 0.8798611111111111 | 0 |
| 0.8805555555555555 | 0 |
| 0.88125 | 0 |
| 0.8819444444444445 | 0 |
| 0.8826388888888889 | 0 |
| 0.8833333333333333 | 0 |
| 0.8840277777777777 | 0 |
| 0.8847222222222223 | 0 |
| 0.8854166666666666 | 0 |
| 0.8861111111111111 | 0 |
| 0.8868055555555556 | 0 |
| 0.8875000000000001 | 0 |
| 0.8881944444444444 | 0 |
| 0.8888888888888888 | 0 |
| 0.8895833333333334 | 0 |
| 0.8902777777777778 | 0 |
| 0.8909722222222222 | 0 |
| 0.8916666666666666 | 0 |
| 0.8923611111111112 | 0 |
| 0.8930555555555556 | 0 |
| 0.8937499999999999 | 0 |
| 0.8944444444444444 | 0 |
| 0.8951388888888889 | 0 |
| 0.8958333333333334 | 0 |
| 0.8965277777777777 | 0 |
| 0.8972222222222223 | 0 |
| 0.8979166666666667 | 0 |
| 0.8986111111111111 | 0 |
| 0.8993055555555555 | 0 |
| 0.9 | 0 |
| 0.9006944444444445 | 0 |
| 0.9013888888888889 | 0 |
| 0.9020833333333332 | 0 |
| 0.9027777777777778 | 0 |
| 0.9034722222222222 | 0 |
| 0.9041666666666667 | 0 |
| 0.904861111111111 | 0 |
| 0.9055555555555556 | 0 |
| 0.90625 | 0 |
| 0.9069444444444444 | 0 |
| 0.907638888888889 | 0 |
| 0.9083333333333333 | 0 |
| 0.9090277777777778 | 0 |
| 0.9097222222222222 | 0 |
| 0.9104166666666668 | 0 |
| 0.9111111111111111 | 0 |
| 0.9118055555555555 | 0 |
| 0.9125 | 0 |
| 0.9131944444444445 | 0 |
| 0.9138888888888889 | 0 |
| 0.9145833333333333 | 0 |
| 0.9152777777777777 | 0 |
| 0.9159722222222223 | 0 |
| 0.9166666666666666 | 0 |
| 0.9173611111111111 | 0 |
| 0.9180555555555556 | 0 |
| 0.9187500000000001 | 0 |
| 0.9194444444444444 | 0 |
| 0.9201388888888888 | 0 |
| 0.9208333333333334 | 0 |
| 0.9215277777777778 | 0 |
| 0.9222222222222222 | 0 |
| 0.9229166666666666 | 0 |
| 0.9236111111111112 | 0 |
| 0.9243055555555556 | 0 |
| 0.9249999999999999 | 0 |
| 0.9256944444444444 | 0 |
| 0.9263888888888889 | 0 |
| 0.9270833333333334 | 0 |
| 0.9277777777777777 | 0 |
| 0.9284722222222223 | 0 |
| 0.9291666666666667 | 0 |
| 0.9298611111111111 | 0 |
| 0.9305555555555555 | 0 |
| 0.93125 | 0 |
| 0.9319444444444445 | 0 |
| 0.9326388888888889 | 0 |
| 0.9333333333333332 | 0 |
| 0.9340277777777778 | 0 |
| 0.9347222222222222 | 0 |
| 0.9354166666666667 | 0 |
| 0.936111111111111 | 0 |
| 0.9368055555555556 | 0 |
| 0.9375 | 0 |
| 0.9381944444444444 | 0 |
| 0.938888888888889 | 0 |
| 0.9395833333333333 | 0 |
| 0.9402777777777778 | 0 |
| 0.9409722222222222 | 0 |
| 0.9416666666666668 | 0 |
| 0.9423611111111111 | 0 |
| 0.9430555555555555 | 0 |
| 0.94375 | 0 |
| 0.9444444444444445 | 0 |
| 0.9451388888888889 | 0 |
| 0.9458333333333333 | 0 |
| 0.9465277777777777 | 0 |
| 0.9472222222222223 | 0 |
| 0.9479166666666666 | 0 |
| 0.9486111111111111 | 0 |
| 0.9493055555555556 | 0 |
| 0.9500000000000001 | 0 |
| 0.9506944444444444 | 0 |
| 0.9513888888888888 | 0 |
| 0.9520833333333334 | 0 |
| 0.9527777777777778 | 0 |
| 0.9534722222222222 | 0 |
| 0.9541666666666666 | 0 |
| 0.9548611111111112 | 0 |
| 0.9555555555555556 | 0 |
| 0.9562499999999999 | 0 |
| 0.9569444444444444 | 0 |
| 0.9576388888888889 | 0 |
| 0.9583333333333334 | 0 |
| 0.9590277777777777 | 0 |
| 0.9597222222222223 | 0 |
| 0.9604166666666667 | 0 |
| 0.9611111111111111 | 0 |
| 0.9618055555555555 | 0 |
| 0.9625 | 0 |
| 0.9631944444444445 | 0 |
| 0.9638888888888889 | 0 |
| 0.9645833333333332 | 0 |
| 0.9652777777777778 | 0 |
| 0.9659722222222222 | 0 |
| 0.9666666666666667 | 0 |
| 0.967361111111111 | 0 |
| 0.9680555555555556 | 0 |
| 0.96875 | 0 |
| 0.9694444444444444 | 0 |
| 0.970138888888889 | 0 |
| 0.9708333333333333 | 0 |
| 0.9715277777777778 | 0 |
| 0.9722222222222222 | 0 |
| 0.9729166666666668 | 0 |
| 0.9736111111111111 | 0 |
| 0.9743055555555555 | 0 |
| 0.975 | 0 |
| 0.9756944444444445 | 0 |
| 0.9763888888888889 | 0 |
| 0.9770833333333333 | 0 |
| 0.9777777777777777 | 0 |
| 0.9784722222222223 | 0 |
| 0.9791666666666666 | 0 |
| 0.9798611111111111 | 0 |
| 0.9805555555555556 | 0 |
| 0.9812500000000001 | 0 |
| 0.9819444444444444 | 0 |
| 0.9826388888888888 | 0 |
| 0.9833333333333334 | 0 |
| 0.9840277777777778 | 0 |
| 0.9847222222222222 | 0 |
| 0.9854166666666666 | 0 |
| 0.9861111111111112 | 0 |
| 0.9868055555555556 | 0 |
| 0.9874999999999999 | 0 |
| 0.9881944444444444 | 0 |
| 0.9888888888888889 | 0 |
| 0.9895833333333334 | 0 |
| 0.9902777777777777 | 0 |
| 0.9909722222222223 | 0 |
| 0.9916666666666667 | 0 |
| 0.9923611111111111 | 0 |
| 0.9930555555555555 | 0 |
| 0.99375 | 0 |
| 0.9944444444444445 | 0 |
| 0.9951388888888889 | 0 |
| 0.9958333333333332 | 0 |
| 0.9965277777777778 | 0 |
| 0.9972222222222222 | 0 |
| 0.9979166666666667 | 0 |
| 0.998611111111111 | 0 |
| 0.9993055555555556 | 0 |